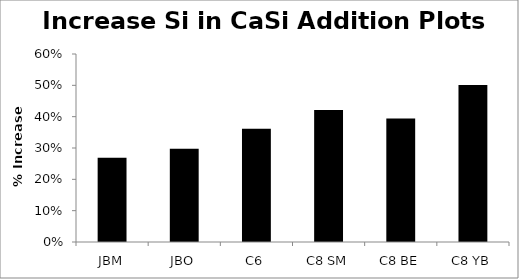
| Category | Series 0 |
|---|---|
| JBM | 0.269 |
| JBO | 0.297 |
| C6 | 0.362 |
| C8 SM | 0.421 |
| C8 BE | 0.394 |
| C8 YB | 0.501 |